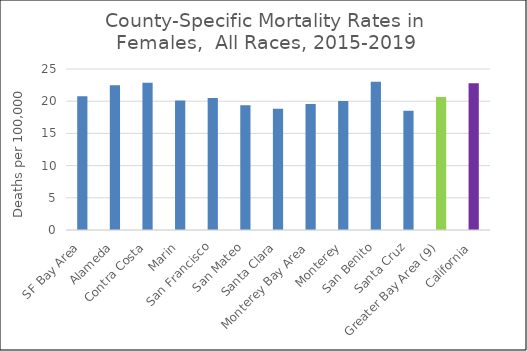
| Category | Female |
|---|---|
| SF Bay Area | 20.78 |
|   Alameda | 22.48 |
|   Contra Costa | 22.87 |
|   Marin | 20.11 |
|   San Francisco | 20.5 |
|   San Mateo | 19.39 |
|   Santa Clara | 18.81 |
| Monterey Bay Area | 19.57 |
|   Monterey | 20.02 |
|   San Benito | 23.01 |
|   Santa Cruz | 18.52 |
| Greater Bay Area (9) | 20.66 |
| California | 22.79 |